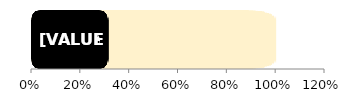
| Category | total | Women |
|---|---|---|
| 0 | 1 | 0.315 |